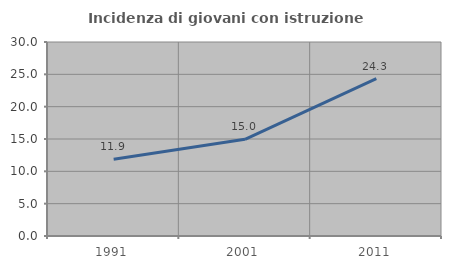
| Category | Incidenza di giovani con istruzione universitaria |
|---|---|
| 1991.0 | 11.853 |
| 2001.0 | 14.953 |
| 2011.0 | 24.332 |